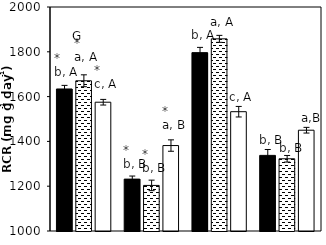
| Category |    A. brasilense |    A. chroococcum |    CK |
|---|---|---|---|
| aCO2-Bt | 1634.054 | 1670.663 | 1574.918 |
| aCO2-XIANYU | 1231.59 | 1203.52 | 1381.443 |
| eCO2-Bt | 1796.273 | 1857.811 | 1532.588 |
| eCO2-XIANYU | 1337.596 | 1322.458 | 1449.971 |